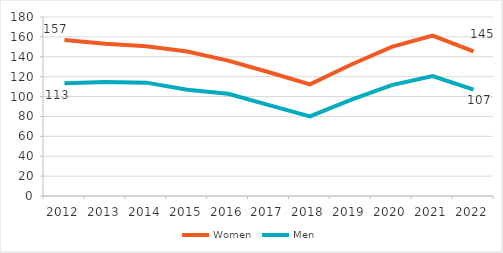
| Category | Women | Men |
|---|---|---|
| 2012.0 | 156.779 | 113.477 |
| 2013.0 | 153.143 | 114.741 |
| 2014.0 | 150.676 | 114.007 |
| 2015.0 | 145.317 | 106.762 |
| 2016.0 | 136.099 | 102.775 |
| 2017.0 | 124.481 | 91.393 |
| 2018.0 | 112.202 | 79.992 |
| 2019.0 | 131.949 | 96.733 |
| 2020.0 | 149.948 | 111.499 |
| 2021.0 | 161.214 | 120.518 |
| 2022.0 | 145.356 | 106.922 |